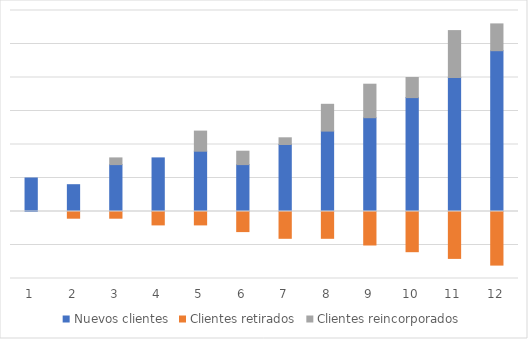
| Category | Nuevos clientes | Clientes retirados | Clientes reincorporados |
|---|---|---|---|
| 0 | 5 | 0 | 0 |
| 1 | 4 | -1 | 0 |
| 2 | 7 | -1 | 1 |
| 3 | 8 | -2 | 0 |
| 4 | 9 | -2 | 3 |
| 5 | 7 | -3 | 2 |
| 6 | 10 | -4 | 1 |
| 7 | 12 | -4 | 4 |
| 8 | 14 | -5 | 5 |
| 9 | 17 | -6 | 3 |
| 10 | 20 | -7 | 7 |
| 11 | 24 | -8 | 4 |